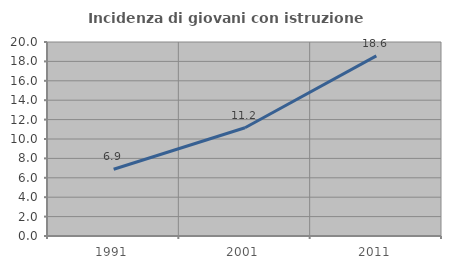
| Category | Incidenza di giovani con istruzione universitaria |
|---|---|
| 1991.0 | 6.883 |
| 2001.0 | 11.16 |
| 2011.0 | 18.571 |